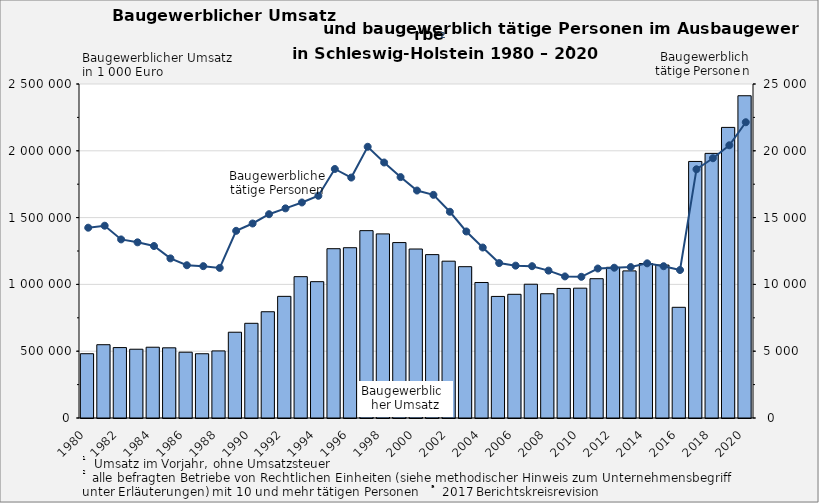
| Category | Baugewerblicher 
Umsatz in 1000 Euro |
|---|---|
| 1980.0 | 481176 |
| 1981.0 | 548606 |
| 1982.0 | 527072 |
| 1983.0 | 514714 |
| 1984.0 | 529751 |
| 1985.0 | 525282 |
| 1986.0 | 492517 |
| 1987.0 | 480997 |
| 1988.0 | 502088 |
| 1989.0 | 641996 |
| 1990.0 | 708757 |
| 1991.0 | 795322 |
| 1992.0 | 910513 |
| 1993.0 | 1057892 |
| 1994.0 | 1020468 |
| 1995.0 | 1267202 |
| 1996.0 | 1274585 |
| 1997.0 | 1402303 |
| 1998.0 | 1377951 |
| 1999.0 | 1313100 |
| 2000.0 | 1264873 |
| 2001.0 | 1222932 |
| 2002.0 | 1173826 |
| 2003.0 | 1132688 |
| 2004.0 | 1014311 |
| 2005.0 | 909914 |
| 2006.0 | 925834 |
| 2007.0 | 1001274 |
| 2008.0 | 930127 |
| 2009.0 | 969939 |
| 2010.0 | 971758 |
| 2011.0 | 1042728 |
| 2012.0 | 1128002 |
| 2013.0 | 1101137 |
| 2014.0 | 1156305 |
| 2015.0 | 1144920 |
| 2016.0 | 828538 |
| 2017.0 | 1920283 |
| 2018.0 | 1980842 |
| 2019.0 | 2175144.56 |
| 2020.0 | 2412149 |